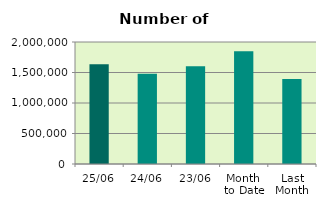
| Category | Series 0 |
|---|---|
| 25/06 | 1633438 |
| 24/06 | 1479632 |
| 23/06 | 1603172 |
| Month 
to Date | 1848666 |
| Last
Month | 1395416 |